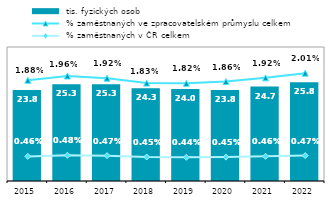
| Category |  tis. fyzických osob |
|---|---|
| 2015.0 | 23.771 |
| 2016.0 | 25.292 |
| 2017.0 | 25.298 |
| 2018.0 | 24.253 |
| 2019.0 | 24.001 |
| 2020.0 | 23.777 |
| 2021.0 | 24.669 |
| 2022.0 | 25.771 |